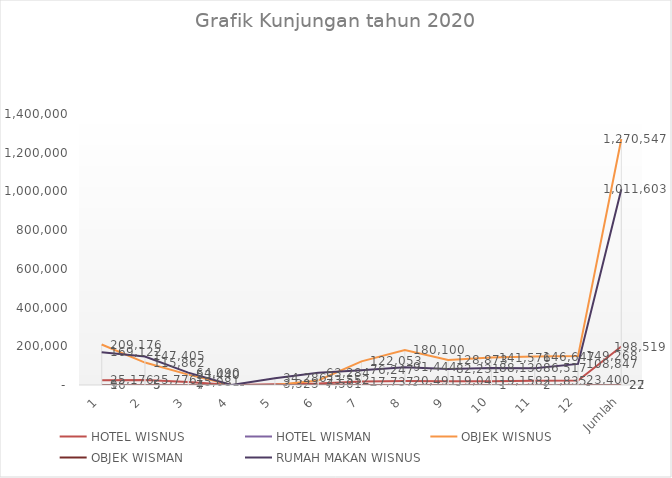
| Category | HOTEL WISNUS | HOTEL WISMAN | OBJEK WISNUS | OBJEK WISMAN | RUMAH MAKAN WISNUS |
|---|---|---|---|---|---|
| 1 | 25176 | 9 | 209176 | 16 | 169122 |
| 2 | 25776 | 5 | 115862 | 5 | 147405 |
| 3 | 15081 | 7 | 53440 | 4 | 64090 |
| 4 | 0 | 0 | 0 | 0 | 0 |
| 5 | 3323 | 0 | 0 | 0 | 34286 |
| 6 | 7501 | 0 | 23552 | 0 | 63284 |
| 7 | 17737 | 0 | 122053 | 0 | 76247 |
| 8 | 20491 | 0 | 180100 | 0 | 91444 |
| 9 | 19041 | 0 | 128873 | 0 | 82231 |
| 10 | 19158 | 1 | 141576 | 0 | 88130 |
| 11 | 21835 | 0 | 146647 | 2 | 86517 |
| 12 | 23400 | 0 | 149268 | 0 | 108847 |
| Jumlah | 198519 | 22 | 1270547 | 27 | 1011603 |